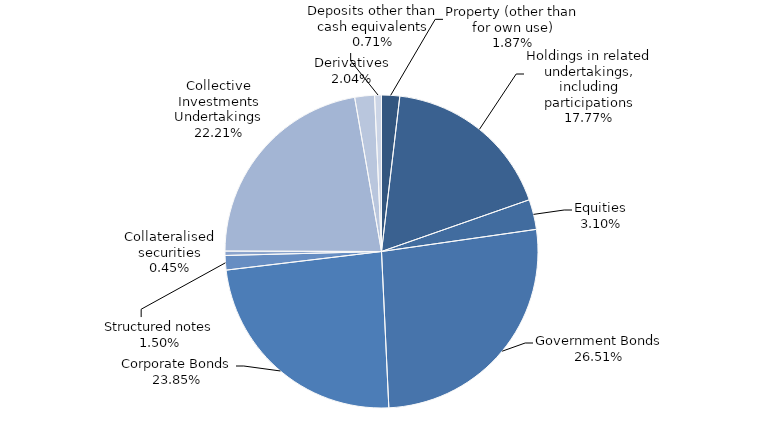
| Category | Series 0 |
|---|---|
| Property (other than for own use) | 114039.85 |
| Holdings in related undertakings, including participations | 1083074.44 |
| Equities | 188794.15 |
| Government Bonds | 1616043.73 |
| Corporate Bonds | 1453609.34 |
| Structured notes | 91063.1 |
| Collateralised securities | 27324.13 |
| Collective Investments Undertakings | 1353819.25 |
| Derivatives | 124176.99 |
| Deposits other than cash equivalents | 43184.76 |